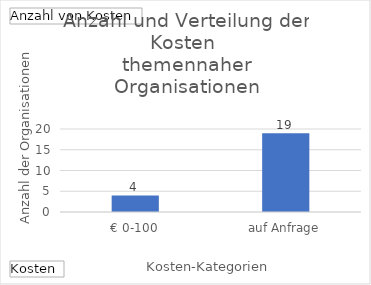
| Category | Ergebnis |
|---|---|
| € 0-100 | 4 |
| auf Anfrage | 19 |